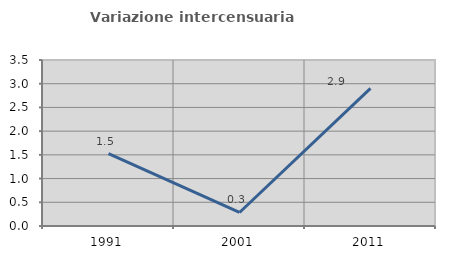
| Category | Variazione intercensuaria annua |
|---|---|
| 1991.0 | 1.524 |
| 2001.0 | 0.285 |
| 2011.0 | 2.9 |